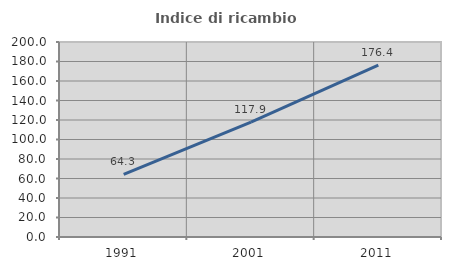
| Category | Indice di ricambio occupazionale  |
|---|---|
| 1991.0 | 64.286 |
| 2001.0 | 117.91 |
| 2011.0 | 176.364 |